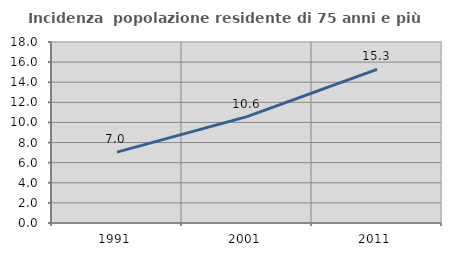
| Category | Incidenza  popolazione residente di 75 anni e più |
|---|---|
| 1991.0 | 7.045 |
| 2001.0 | 10.582 |
| 2011.0 | 15.283 |